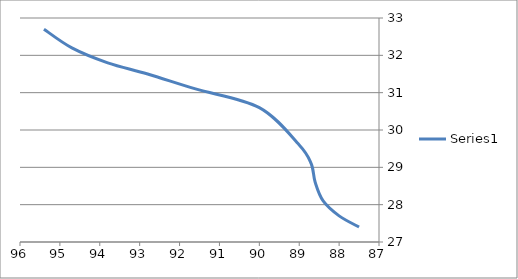
| Category | Series 0 |
|---|---|
| 87.5 | 27.4 |
| 88.0 | 27.7 |
| 88.4 | 28.1 |
| 88.6 | 28.6 |
| 88.7 | 29.1 |
| 89.0 | 29.6 |
| 90.0 | 30.6 |
| 91.6 | 31.1 |
| 92.8 | 31.5 |
| 93.8 | 31.8 |
| 94.7 | 32.2 |
| 95.4 | 32.7 |